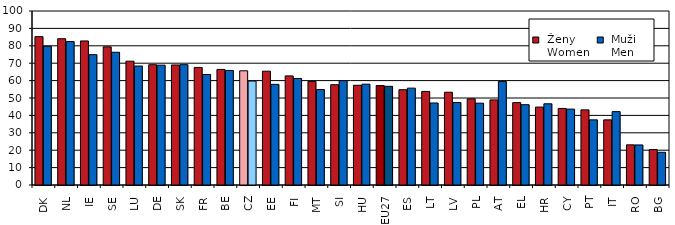
| Category |  Ženy 
 Women |  Muži 
 Men |
|---|---|---|
| DK | 85.252 | 79.72 |
| NL | 84.062 | 82.45 |
| IE | 82.803 | 74.904 |
| SE | 79.384 | 76.292 |
| LU | 71.161 | 68.377 |
| DE | 69.128 | 68.875 |
| SK | 68.987 | 69.161 |
| FR | 67.57 | 63.522 |
| BE | 66.433 | 65.834 |
| CZ | 65.631 | 59.752 |
| EE | 65.406 | 57.84 |
| FI | 62.712 | 61.199 |
| MT | 59.488 | 54.861 |
| SI | 57.638 | 59.977 |
| HU | 57.304 | 57.961 |
| EU27 | 57.156 | 56.711 |
| ES | 54.774 | 55.673 |
| LT | 53.789 | 47.118 |
| LV | 53.317 | 47.392 |
| PL | 49.517 | 47.021 |
| AT | 48.919 | 59.436 |
| EL | 47.336 | 46.154 |
| HR | 44.777 | 46.676 |
| CY | 44.01 | 43.622 |
| PT | 43.184 | 37.447 |
| IT | 37.44 | 42.166 |
| RO | 23.08 | 23.02 |
| BG | 20.342 | 18.802 |